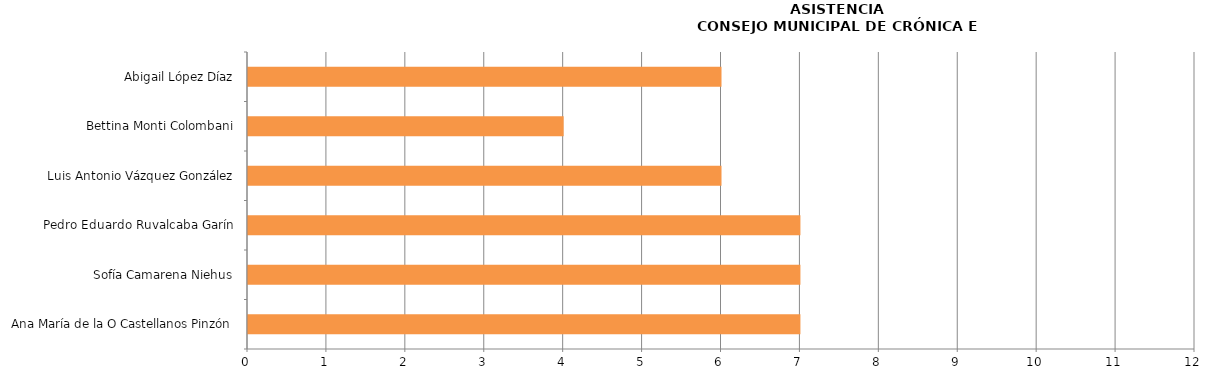
| Category | Series 0 |
|---|---|
| Ana María de la O Castellanos Pinzón | 7 |
| Sofía Camarena Niehus | 7 |
| Pedro Eduardo Ruvalcaba Garín | 7 |
| Luis Antonio Vázquez González | 6 |
| Bettina Monti Colombani | 4 |
| Abigail López Díaz | 6 |